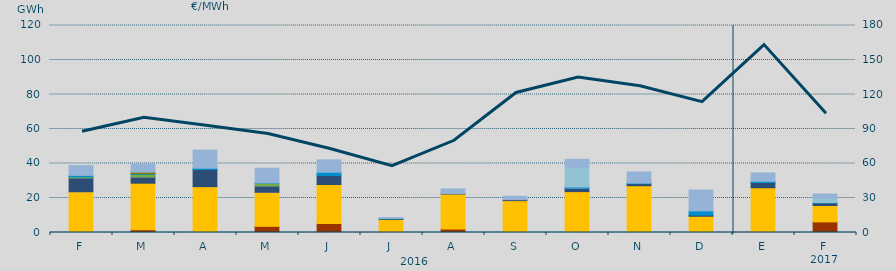
| Category | Carbón | Ciclo Combinado | Cogeneración | Consumo Bombeo | Enlace Península Baleares | Eólica | Hidráulica | Internacionales | Otras Renovables | Residuos no Renovables | Solar fotovoltaica | Solar térmica | Turbinación bombeo |
|---|---|---|---|---|---|---|---|---|---|---|---|---|---|
| F | 0 | 23619.7 | 24.9 | 8015.5 | 155 | 474.7 | 823.7 | 0 | 0 | 0 | 0 | 0 | 5655.5 |
| M | 1586.3 | 26999.7 | 0 | 3618.7 | 83.2 | 1329.1 | 426.3 | 0 | 952.9 | 0 | 0 | 0 | 4767 |
| A | 576.5 | 26003.6 | 0 | 9984.7 | 0 | 0 | 727.3 | 0 | 0 | 0 | 0 | 0 | 10463.6 |
| M | 3569.6 | 19753.8 | 10.4 | 3695 | 26 | 1500 | 196.5 | 0 | 0 | 0 | 0 | 0 | 8519.5 |
| J | 5205 | 22612.8 | 0 | 5244.3 | 0 | 0 | 1878.6 | 0 | 0 | 0 | 0 | 0 | 7187.7 |
| J | 210 | 7404.2 | 0 | 326.1 | 0 | 0 | 195.5 | 0 | 0 | 0 | 0 | 0 | 525.8 |
| A | 2091.8 | 20206 | 0 | 273.8 | 0 | 0 | 0 | 0 | 0 | 0 | 0 | 0 | 2688.1 |
| S | 456.3 | 18024.6 | 0 | 521.1 | 279.8 | 0 | 0 | 0 | 0 | 0 | 0 | 0 | 1707.9 |
| O | 53.4 | 23642.3 | 0 | 1821.5 | 200.8 | 0 | 661 | 11465.7 | 0 | 0 | 0 | 0 | 4580.4 |
| N | 0 | 27130.5 | 0 | 1183.5 | 0 | 0 | 312.1 | 0 | 0 | 0 | 0 | 0 | 6456 |
| D | 0 | 9410.5 | 0 | 701.1 | 0 | 0 | 2449.9 | 0 | 0 | 0 | 0 | 0 | 12070.5 |
| E | 0 | 25945.3 | 0 | 3031.3 | 0 | 0 | 733.3 | 0 | 0 | 0 | 0 | 0 | 4804 |
| F | 6150 | 9508.4 | 0 | 1469.4 | 0 | 0 | 198 | 2463.6 | 0 | 0 | 0 | 0 | 2519.7 |